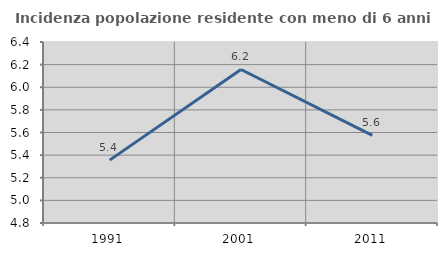
| Category | Incidenza popolazione residente con meno di 6 anni |
|---|---|
| 1991.0 | 5.356 |
| 2001.0 | 6.157 |
| 2011.0 | 5.575 |